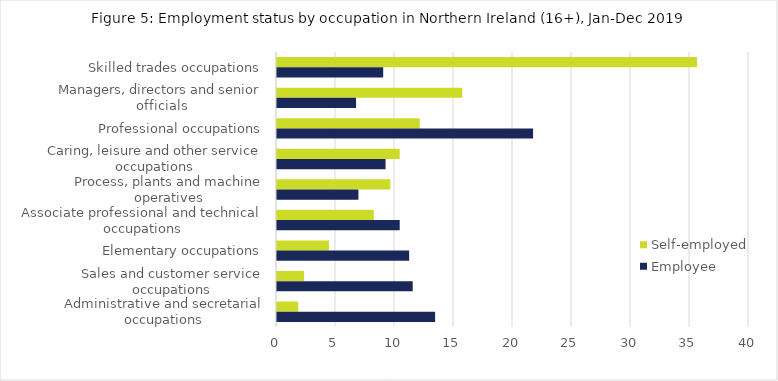
| Category | Self-employed | Employee |
|---|---|---|
| Skilled trades occupations | 35.6 | 9 |
| Managers, directors and senior officials | 15.7 | 6.7 |
| Professional occupations | 12.1 | 21.7 |
| Caring, leisure and other service occupations | 10.4 | 9.2 |
| Process, plants and machine operatives | 9.6 | 6.9 |
| Associate professional and technical occupations | 8.2 | 10.4 |
| Elementary occupations | 4.4 | 11.2 |
| Sales and customer service occupations | 2.3 | 11.5 |
| Administrative and secretarial occupations | 1.8 | 13.4 |